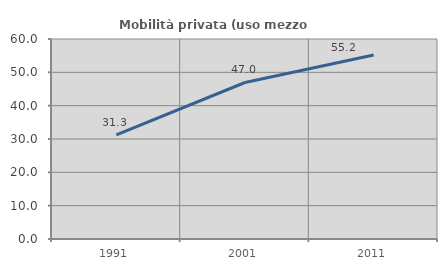
| Category | Mobilità privata (uso mezzo privato) |
|---|---|
| 1991.0 | 31.269 |
| 2001.0 | 46.95 |
| 2011.0 | 55.221 |